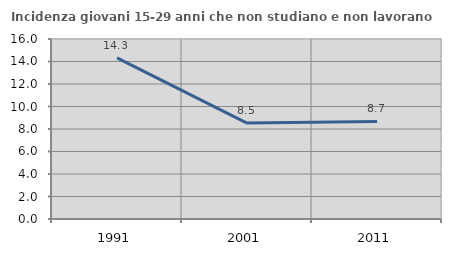
| Category | Incidenza giovani 15-29 anni che non studiano e non lavorano  |
|---|---|
| 1991.0 | 14.315 |
| 2001.0 | 8.527 |
| 2011.0 | 8.676 |